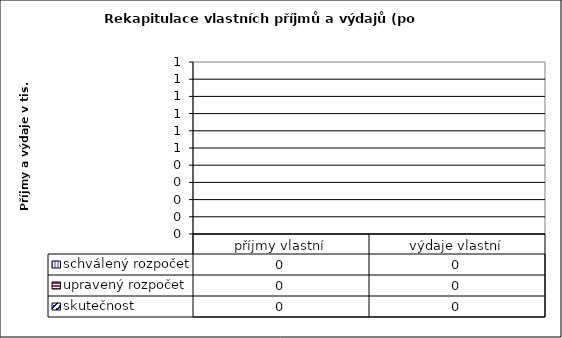
| Category | schválený rozpočet | upravený rozpočet | skutečnost |
|---|---|---|---|
| příjmy vlastní | 0 | 0 | 0 |
| výdaje vlastní | 0 | 0 | 0 |